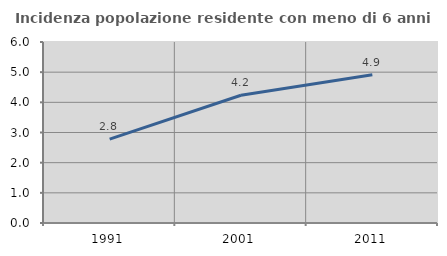
| Category | Incidenza popolazione residente con meno di 6 anni |
|---|---|
| 1991.0 | 2.781 |
| 2001.0 | 4.236 |
| 2011.0 | 4.916 |